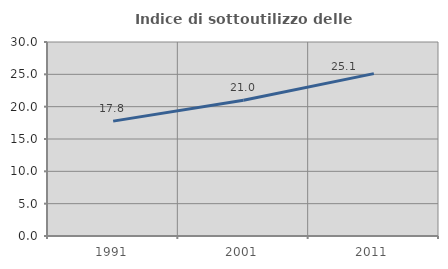
| Category | Indice di sottoutilizzo delle abitazioni  |
|---|---|
| 1991.0 | 17.766 |
| 2001.0 | 21.007 |
| 2011.0 | 25.109 |